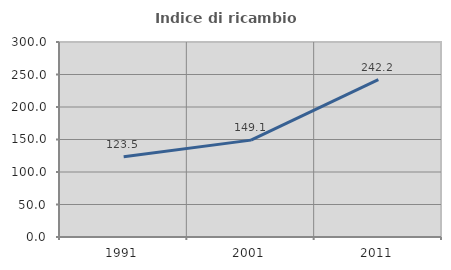
| Category | Indice di ricambio occupazionale  |
|---|---|
| 1991.0 | 123.497 |
| 2001.0 | 149.053 |
| 2011.0 | 242.193 |